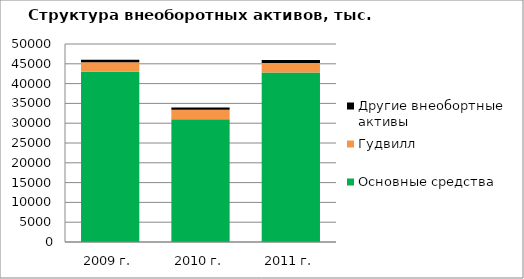
| Category | Основные средства | Гудвилл | Другие внеобортные активы |
|---|---|---|---|
| 2009 г. | 43000 | 2394 | 630 |
| 2010 г. | 31028 | 2394 | 513 |
| 2011 г. | 42785 | 2394 | 775 |